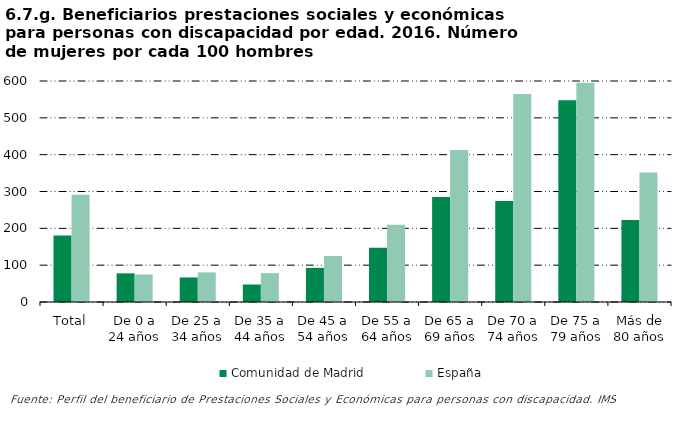
| Category | Comunidad de Madrid | España |
|---|---|---|
| Total | 180.346 | 291.233 |
| De 0 a 24 años | 77.778 | 74.638 |
| De 25 a 34 años | 66.667 | 80.423 |
| De 35 a 44 años | 47.5 | 78.346 |
| De 45 a 54 años | 92.683 | 124.908 |
| De 55 a 64 años | 147 | 209.39 |
| De 65 a 69 años | 284.848 | 412.712 |
| De 70 a 74 años | 274.286 | 564.977 |
| De 75 a 79 años | 547.619 | 595.219 |
| Más de 80 años | 222.689 | 351.539 |